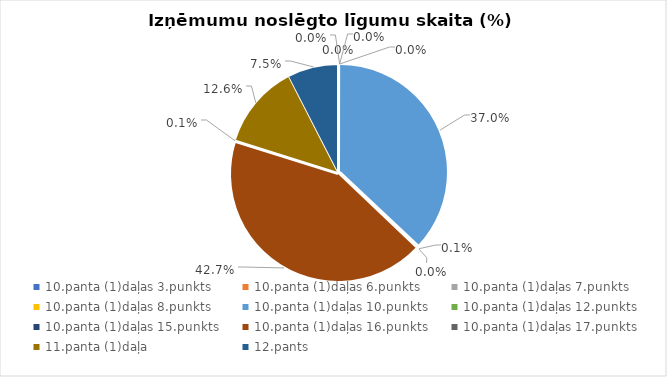
| Category | Īpatsvars (%) |
|---|---|
| 10.panta (1)daļas 3.punkts | 0 |
| 10.panta (1)daļas 6.punkts | 0 |
| 10.panta (1)daļas 7.punkts | 0 |
| 10.panta (1)daļas 8.punkts | 0 |
| 10.panta (1)daļas 10.punkts | 0.37 |
| 10.panta (1)daļas 12.punkts | 0.001 |
| 10.panta (1)daļas 15.punkts | 0 |
| 10.panta (1)daļas 16.punkts | 0.427 |
| 10.panta (1)daļas 17.punkts | 0.001 |
| 11.panta (1)daļa | 0.126 |
| 12.pants | 0.075 |